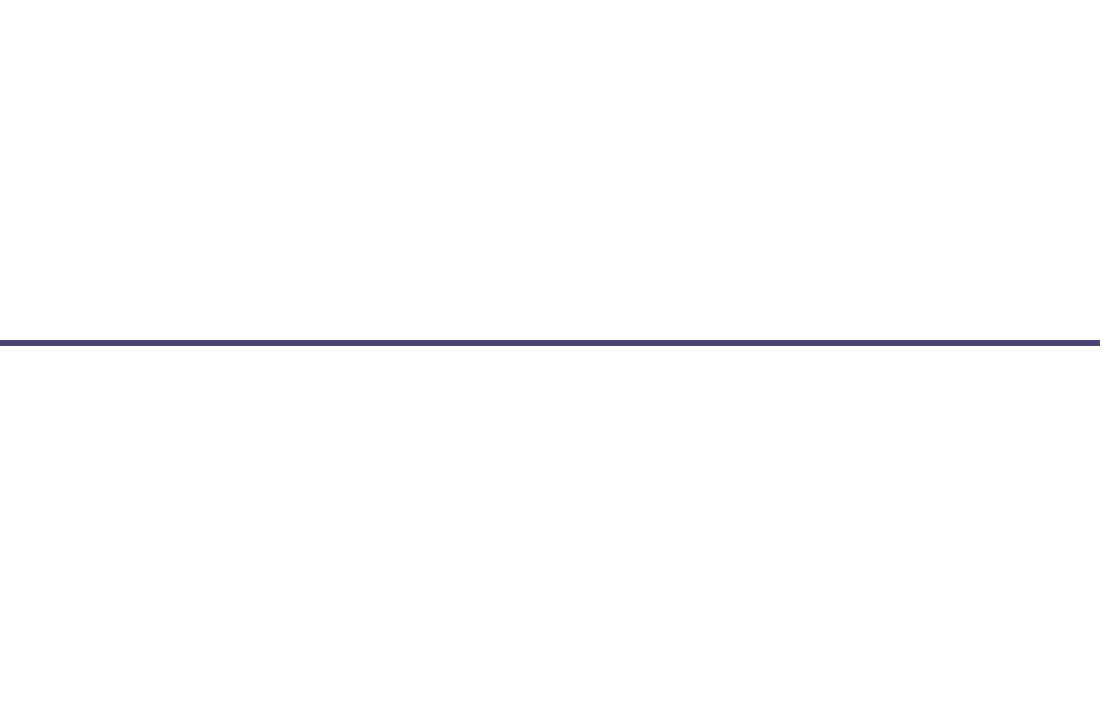
| Category | Position |
|---|---|
| 0 | 1 |
| 1 | -2 |
| 2 | 1 |
| 3 | -1 |
| 4 | -0.5 |
| 5 | 2 |
| 6 | 0.5 |
| 7 | -1 |
| 8 | 0.5 |
| 9 | -2 |